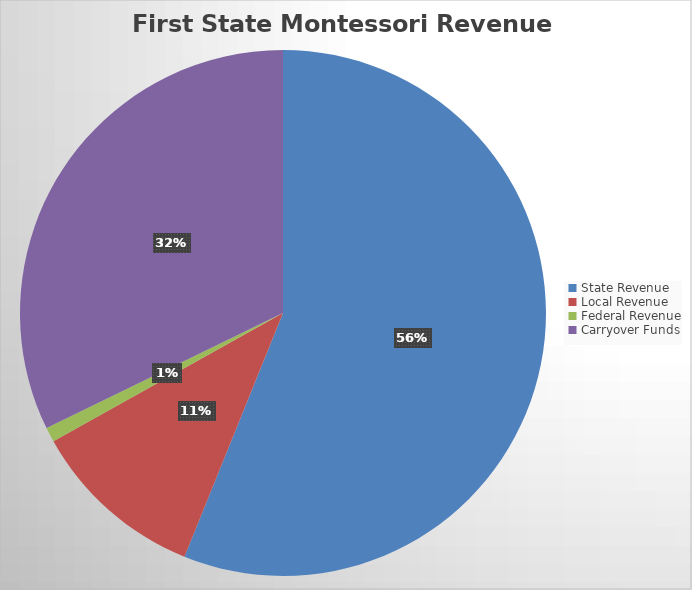
| Category | Series 0 |
|---|---|
| State Revenue | 5488927.25 |
| Local Revenue | 1054145.58 |
| Federal Revenue | 88059 |
| Carryover Funds | 3150705.38 |